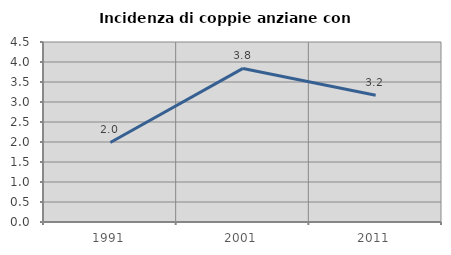
| Category | Incidenza di coppie anziane con figli |
|---|---|
| 1991.0 | 1.988 |
| 2001.0 | 3.84 |
| 2011.0 | 3.169 |